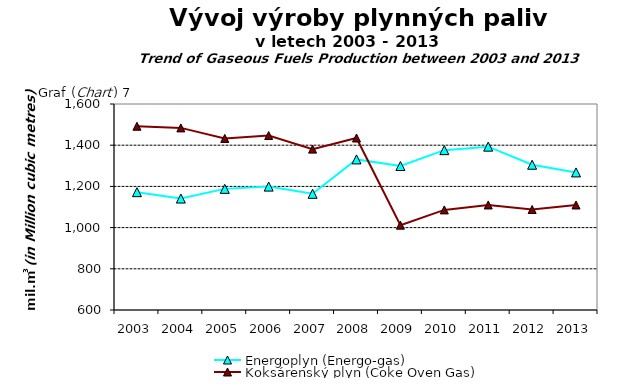
| Category | Energoplyn (Energo-gas) | Koksárenský plyn (Coke Oven Gas) |
|---|---|---|
| 2003.0 | 1172 | 1492 |
| 2004.0 | 1141 | 1484 |
| 2005.0 | 1188 | 1433 |
| 2006.0 | 1199 | 1447 |
| 2007.0 | 1164 | 1381 |
| 2008.0 | 1331 | 1435 |
| 2009.0 | 1298.811 | 1011.813 |
| 2010.0 | 1376 | 1086 |
| 2011.0 | 1393 | 1110 |
| 2012.0 | 1305.17 | 1087.826 |
| 2013.0 | 1267.91 | 1109.802 |